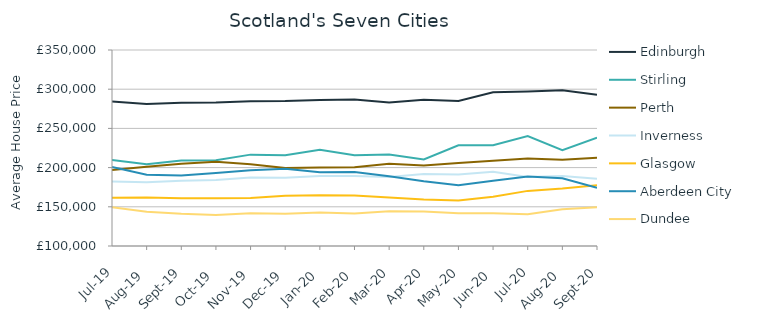
| Category | Edinburgh | Stirling | Perth | Inverness | Glasgow | Aberdeen City | Dundee |
|---|---|---|---|---|---|---|---|
| 2019-07-01 | 284443.512 | 209601.669 | 196904.856 | 182190.85 | 161455.521 | 200826.826 | 149418.504 |
| 2019-08-01 | 280990.89 | 204203.649 | 201168.759 | 181393.438 | 161907.638 | 190825.196 | 143823.117 |
| 2019-09-01 | 282751.005 | 208901.377 | 204826.406 | 183299.844 | 160811.954 | 189957.692 | 141004.087 |
| 2019-10-01 | 283096.141 | 209322.975 | 207402.29 | 184293.292 | 160878.964 | 193090.867 | 139532.183 |
| 2019-11-01 | 284543.443 | 216538.871 | 204274.414 | 187275.368 | 161183.936 | 196487.819 | 141801.266 |
| 2019-12-01 | 284790.145 | 215739.589 | 199527.674 | 186897.345 | 164085.144 | 198659.348 | 141103.194 |
| 2020-01-01 | 286081.195 | 222761.096 | 200264.714 | 189224.929 | 164705.01 | 194051.342 | 142885.44 |
| 2020-02-01 | 286903.419 | 215663.669 | 200520.949 | 189183.177 | 164342.751 | 194536.245 | 141487.949 |
| 2020-03-01 | 283189.011 | 216665.703 | 205008.794 | 188001.708 | 162012.451 | 189076.306 | 144342.336 |
| 2020-04-01 | 286418.1 | 210500.685 | 202552.516 | 191816.114 | 159167.402 | 182583.977 | 143905.469 |
| 2020-05-01 | 285040.348 | 228519.167 | 205803.298 | 191333.982 | 157957.307 | 177471.481 | 141700.649 |
| 2020-06-01 | 296001.143 | 228602.921 | 208735.785 | 194563.181 | 162715.741 | 183323.336 | 141791.073 |
| 2020-07-01 | 297198.32 | 240113.243 | 211529.95 | 188123.246 | 170309.615 | 188582.86 | 140354.552 |
| 2020-08-01 | 298600.298 | 222333.656 | 210093.028 | 189170.055 | 173284.826 | 186380.011 | 146823.828 |
| 2020-09-01 | 292765.531 | 238294.287 | 212502.648 | 185683.584 | 177495.41 | 174117.449 | 149532.133 |